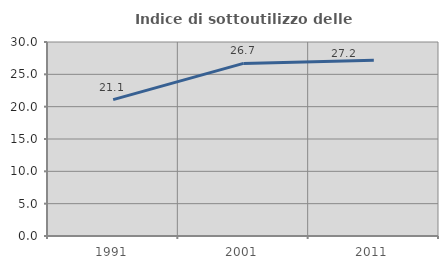
| Category | Indice di sottoutilizzo delle abitazioni  |
|---|---|
| 1991.0 | 21.084 |
| 2001.0 | 26.688 |
| 2011.0 | 27.181 |